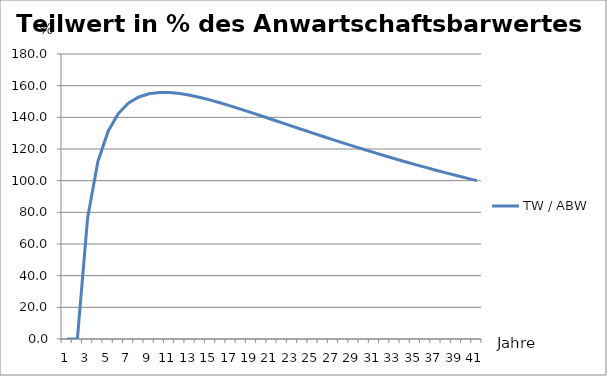
| Category | TW / ABW |
|---|---|
| 0 | 0 |
| 1 | 0 |
| 2 | 76.487 |
| 3 | 111.999 |
| 4 | 131.225 |
| 5 | 142.391 |
| 6 | 149.017 |
| 7 | 152.864 |
| 8 | 154.904 |
| 9 | 155.721 |
| 10 | 155.684 |
| 11 | 155.036 |
| 12 | 153.947 |
| 13 | 152.533 |
| 14 | 150.883 |
| 15 | 149.058 |
| 16 | 147.107 |
| 17 | 145.067 |
| 18 | 142.964 |
| 19 | 140.822 |
| 20 | 138.656 |
| 21 | 136.481 |
| 22 | 134.307 |
| 23 | 132.143 |
| 24 | 129.995 |
| 25 | 127.868 |
| 26 | 125.768 |
| 27 | 123.696 |
| 28 | 121.656 |
| 29 | 119.649 |
| 30 | 117.678 |
| 31 | 115.743 |
| 32 | 113.844 |
| 33 | 111.983 |
| 34 | 110.159 |
| 35 | 108.373 |
| 36 | 106.625 |
| 37 | 104.914 |
| 38 | 103.239 |
| 39 | 101.602 |
| 40 | 100 |